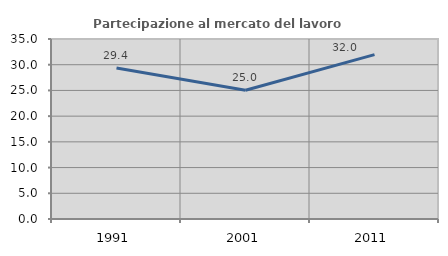
| Category | Partecipazione al mercato del lavoro  femminile |
|---|---|
| 1991.0 | 29.369 |
| 2001.0 | 25.025 |
| 2011.0 | 31.959 |